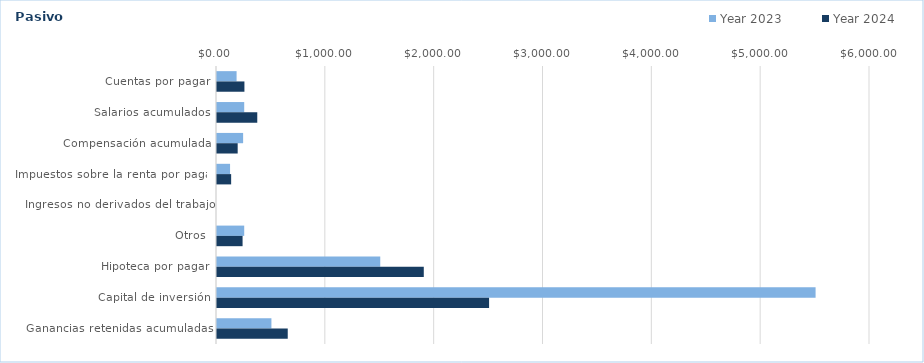
| Category | Year 2023 | Year 2024 |
|---|---|---|
| Cuentas por pagar | 180 | 252 |
| Salarios acumulados | 250 | 370 |
| Compensación acumulada | 240 | 190 |
| Impuestos sobre la renta por pagar | 120 | 130 |
| Ingresos no derivados del trabajo | 0 | 0 |
| Otros | 250 | 235 |
| Hipoteca por pagar | 1500 | 1900 |
| Capital de inversión | 5500 | 2500 |
| Ganancias retenidas acumuladas | 500 | 650 |